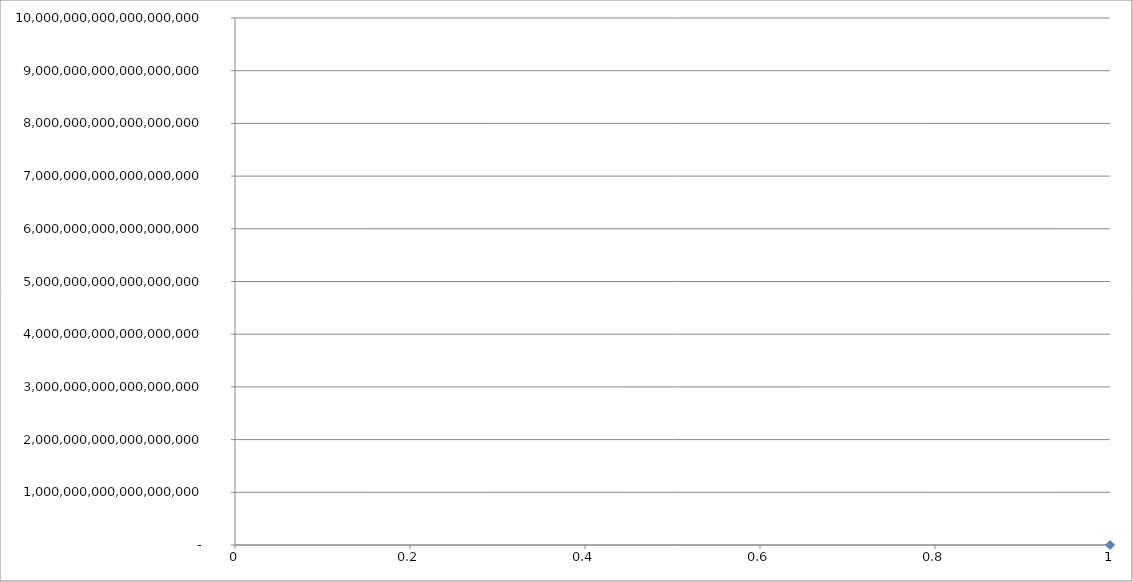
| Category | Series 0 |
|---|---|
| 0 | 1 |
| 1 | 2 |
| 2 | 4 |
| 3 | 8 |
| 4 | 16 |
| 5 | 32 |
| 6 | 64 |
| 7 | 128 |
| 8 | 256 |
| 9 | 512 |
| 10 | 1024 |
| 11 | 2048 |
| 12 | 4096 |
| 13 | 8192 |
| 14 | 16384 |
| 15 | 32768 |
| 16 | 65536 |
| 17 | 131072 |
| 18 | 262144 |
| 19 | 524288 |
| 20 | 1048576 |
| 21 | 2097152 |
| 22 | 4194304 |
| 23 | 8388608 |
| 24 | 16777216 |
| 25 | 33554432 |
| 26 | 67108864 |
| 27 | 134217728 |
| 28 | 268435456 |
| 29 | 536870912 |
| 30 | 1073741824 |
| 31 | 2147483648 |
| 32 | 4294967296 |
| 33 | 8589934592 |
| 34 | 17179869184 |
| 35 | 34359738368 |
| 36 | 68719476736 |
| 37 | 137438953472 |
| 38 | 274877906944 |
| 39 | 549755813888 |
| 40 | 1099511627776 |
| 41 | 2199023255552 |
| 42 | 4398046511104 |
| 43 | 8796093022208 |
| 44 | 17592186044416 |
| 45 | 35184372088832 |
| 46 | 70368744177664 |
| 47 | 140737488355328 |
| 48 | 281474976710656 |
| 49 | 562949953421312 |
| 50 | 1125899906842624 |
| 51 | 2251799813685248 |
| 52 | 4503599627370496 |
| 53 | 9007199254740992 |
| 54 | 18014398509481984 |
| 55 | 36028797018963968 |
| 56 | 72057594037927936 |
| 57 | 144115188075855872 |
| 58 | 288230376151711744 |
| 59 | 576460752303423488 |
| 60 | 1152921504606846976 |
| 61 | 2305843009213693952 |
| 62 | 4611686018427387904 |
| 63 | 9223372036854775808 |